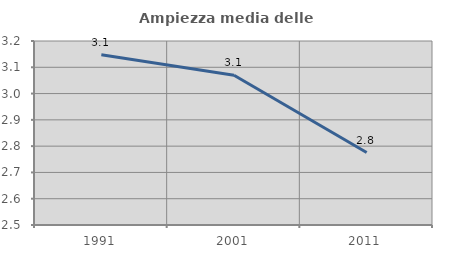
| Category | Ampiezza media delle famiglie |
|---|---|
| 1991.0 | 3.147 |
| 2001.0 | 3.07 |
| 2011.0 | 2.776 |